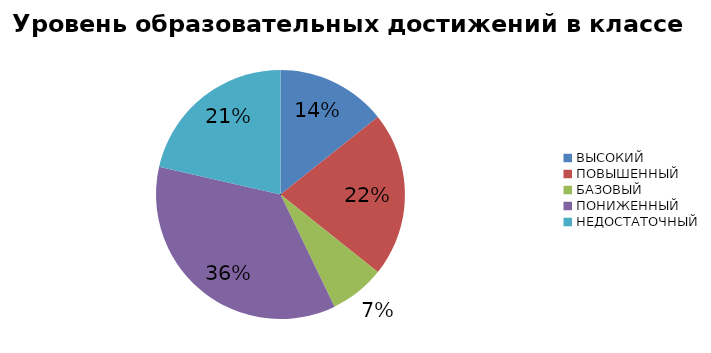
| Category | Series 0 |
|---|---|
| ВЫСОКИЙ | 14.286 |
| ПОВЫШЕННЫЙ | 21.429 |
| БАЗОВЫЙ | 7.143 |
| ПОНИЖЕННЫЙ | 35.714 |
| НЕДОСТАТОЧНЫЙ | 21.429 |